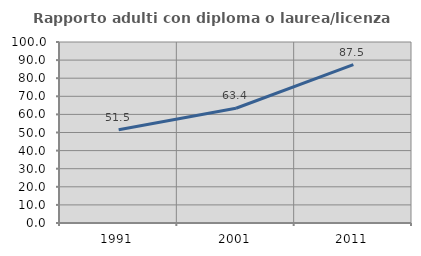
| Category | Rapporto adulti con diploma o laurea/licenza media  |
|---|---|
| 1991.0 | 51.546 |
| 2001.0 | 63.415 |
| 2011.0 | 87.5 |